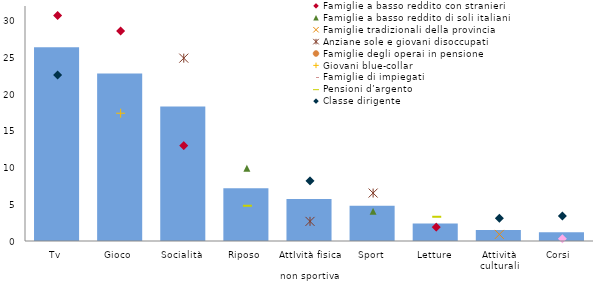
| Category | Series 0 |
|---|---|
| Tv | 26.4 |
| Gioco | 22.8 |
| Socialità | 18.3 |
| Riposo | 7.2 |
| AttIvità fisica 
non sportiva | 5.706 |
| Sport | 4.805 |
| Letture | 2.4 |
| Attività culturali | 1.5 |
| Corsi  | 1.2 |